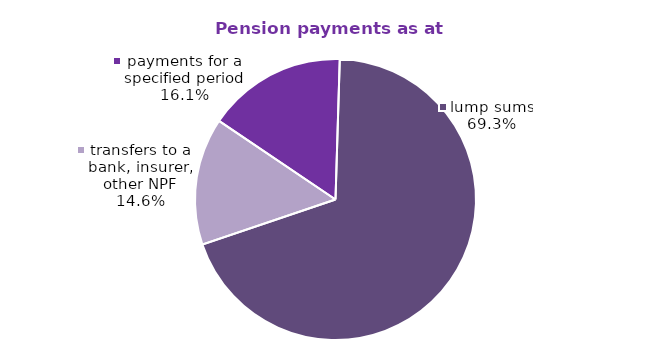
| Category | Series 0 |
|---|---|
| payments for a specified period | 86.19 |
| lump sums | 372.494 |
| transfers to a bank, insurer, other NPF | 78.633 |